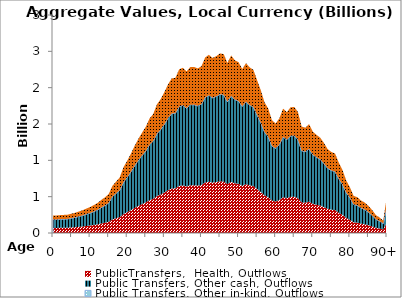
| Category | PublicTransfers,  Health, Outflows | Public Transfers, Other cash, Outflows | Public Transfers, Other in-kind, Outflows | Public Transfers, Education, Outflows |
|---|---|---|---|---|
| 0 | 69.489 | 117.113 |  | 54.801 |
|  | 69.444 | 117.037 |  | 54.765 |
| 2 | 71.027 | 119.704 |  | 56.014 |
| 3 | 71.808 | 121.021 |  | 56.63 |
| 4 | 72.834 | 122.75 |  | 57.439 |
| 5 | 76.683 | 129.238 |  | 60.475 |
| 6 | 80.209 | 135.179 |  | 63.255 |
| 7 | 85.459 | 144.027 |  | 67.395 |
| 8 | 90.337 | 152.249 |  | 71.243 |
| 9 | 96.839 | 163.208 |  | 76.37 |
| 10 | 102.872 | 173.375 |  | 81.128 |
| 11 | 110.398 | 186.059 |  | 87.063 |
| 12 | 118.968 | 200.502 |  | 93.822 |
| 13 | 130.981 | 220.749 |  | 103.296 |
| 14 | 141.222 | 238.008 |  | 111.372 |
| 15 | 154.235 | 259.939 |  | 121.634 |
| 16 | 186.57 | 314.435 |  | 147.135 |
| 17 | 203.7 | 343.306 |  | 160.644 |
| 18 | 220.245 | 371.19 |  | 173.692 |
| 19 | 260.768 | 439.484 |  | 205.649 |
| 20 | 286.414 | 482.706 |  | 225.874 |
| 21 | 314.338 | 529.769 |  | 247.897 |
| 22 | 345.374 | 582.075 |  | 272.372 |
| 23 | 372.863 | 628.404 |  | 294.051 |
| 24 | 397.511 | 669.943 |  | 313.489 |
| 25 | 420.915 | 709.387 |  | 331.946 |
| 26 | 453.218 | 763.83 |  | 357.422 |
| 27 | 471.333 | 794.36 |  | 371.708 |
| 28 | 509.352 | 858.435 |  | 401.691 |
| 29 | 530.153 | 893.491 |  | 418.094 |
| 30 | 557.636 | 939.809 |  | 439.768 |
| 31 | 588.941 | 992.57 |  | 464.457 |
| 32 | 612.614 | 1032.466 |  | 483.126 |
| 33 | 614.773 | 1036.106 |  | 484.829 |
| 34 | 648.261 | 1092.545 |  | 511.238 |
| 35 | 654.537 | 1103.122 |  | 516.188 |
| 36 | 640.329 | 1079.176 |  | 504.983 |
| 37 | 657.621 | 1108.319 |  | 518.62 |
| 38 | 657.965 | 1108.899 |  | 518.891 |
| 39 | 651.971 | 1098.796 |  | 514.164 |
| 40 | 660.649 | 1113.422 |  | 521.007 |
| 41 | 695.351 | 1171.907 |  | 548.375 |
| 42 | 706.009 | 1189.869 |  | 556.78 |
| 43 | 693.317 | 1168.48 |  | 546.771 |
| 44 | 700.495 | 1180.577 |  | 552.431 |
| 45 | 711.572 | 1199.246 |  | 561.167 |
| 46 | 708.679 | 1194.369 |  | 558.885 |
| 47 | 673.367 | 1134.856 |  | 531.038 |
| 48 | 703.459 | 1185.571 |  | 554.769 |
| 49 | 684.349 | 1153.365 |  | 539.698 |
| 50 | 676.696 | 1140.466 |  | 533.662 |
| 51 | 649.328 | 1094.342 |  | 512.079 |
| 52 | 672.863 | 1134.007 |  | 530.64 |
| 53 | 655.966 | 1105.529 |  | 517.314 |
| 54 | 646.171 | 1089.021 |  | 509.59 |
| 55 | 605.417 | 1020.337 |  | 477.45 |
| 56 | 565.157 | 952.485 |  | 445.7 |
| 57 | 517.659 | 872.434 |  | 408.241 |
| 58 | 492.87 | 830.657 |  | 388.692 |
| 59 | 446.814 | 753.036 |  | 352.371 |
| 60 | 434.014 | 731.463 |  | 342.276 |
| 61 | 454.388 | 765.801 |  | 358.344 |
| 62 | 492.766 | 830.481 |  | 388.61 |
| 63 | 478.53 | 806.488 |  | 377.383 |
| 64 | 497.667 | 838.741 |  | 392.475 |
| 65 | 499.55 | 841.914 |  | 393.96 |
| 66 | 479.434 | 808.012 |  | 378.096 |
| 67 | 421.891 | 711.032 |  | 332.716 |
| 68 | 417.215 | 703.152 |  | 329.029 |
| 69 | 431.021 | 726.419 |  | 339.916 |
| 70 | 401.762 | 677.109 |  | 316.842 |
| 71 | 388.836 | 655.324 |  | 306.648 |
| 72 | 377.755 | 636.647 |  | 297.909 |
| 73 | 357.015 | 601.694 |  | 281.553 |
| 74 | 332.484 | 560.35 |  | 262.207 |
| 75 | 321.027 | 541.041 |  | 253.171 |
| 76 | 315.016 | 530.91 |  | 248.431 |
| 77 | 278.957 | 470.139 |  | 219.994 |
| 78 | 250.095 | 421.497 |  | 197.233 |
| 79 | 208.512 | 351.415 |  | 164.439 |
| 80 | 181.312 | 305.573 |  | 142.988 |
| 81 | 147.035 | 247.804 |  | 115.956 |
| 82 | 142.046 | 239.397 |  | 112.022 |
| 83 | 128.607 | 216.747 |  | 101.423 |
| 84 | 120.616 | 203.28 |  | 95.122 |
| 85 | 107.421 | 181.042 |  | 84.716 |
| 86 | 91.135 | 153.594 |  | 71.872 |
| 87 | 71.121 | 119.863 |  | 56.088 |
| 88 | 61.384 | 103.453 |  | 48.409 |
| 89 | 48.907 | 82.426 |  | 38.57 |
| 90+ | 148.742 | 250.682 |  | 117.302 |